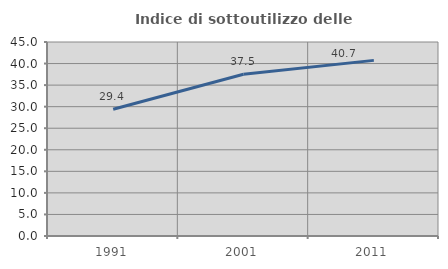
| Category | Indice di sottoutilizzo delle abitazioni  |
|---|---|
| 1991.0 | 29.4 |
| 2001.0 | 37.519 |
| 2011.0 | 40.736 |